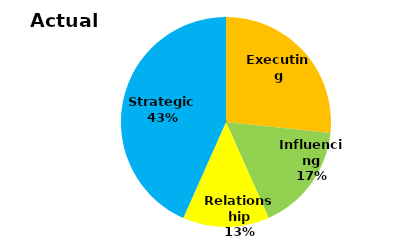
| Category | Series 0 |
|---|---|
| Executing | 0.267 |
| Influencing | 0.167 |
| Relationship | 0.133 |
| Strategic  | 0.433 |